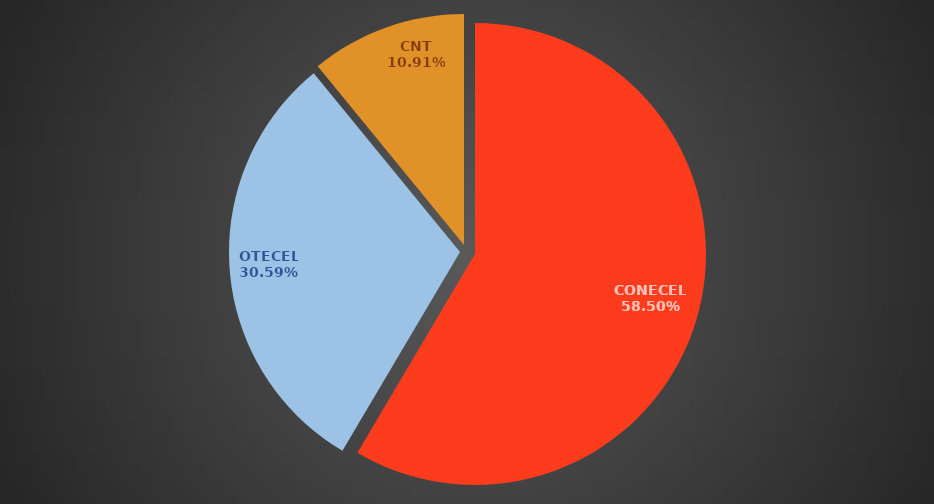
| Category | Feb 2017 |
|---|---|
| CONECEL | 8756687 |
| OTECEL | 4578932 |
| CNT | 1633862 |